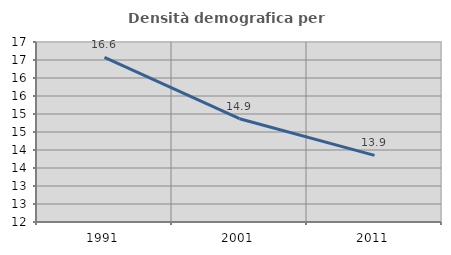
| Category | Densità demografica |
|---|---|
| 1991.0 | 16.574 |
| 2001.0 | 14.868 |
| 2011.0 | 13.851 |